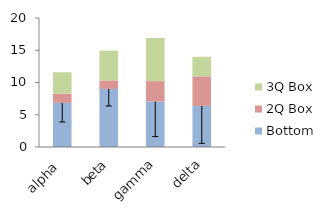
| Category | Bottom | 2Q Box | 3Q Box |
|---|---|---|---|
| alpha | 6.848 | 1.438 | 3.305 |
| beta | 9.003 | 1.322 | 4.613 |
| gamma | 7.052 | 3.162 | 6.683 |
| delta | 6.37 | 4.585 | 3.037 |